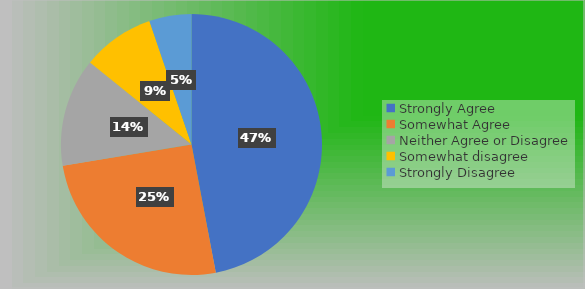
| Category | Series 0 |
|---|---|
| Strongly Agree | 63 |
| Somewhat Agree | 34 |
| Neither Agree or Disagree | 18 |
| Somewhat disagree | 12 |
| Strongly Disagree | 7 |